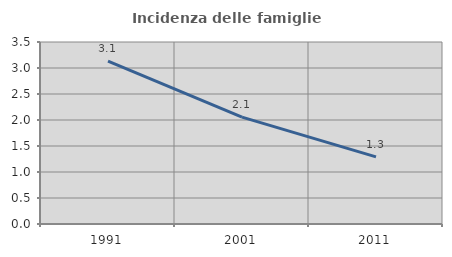
| Category | Incidenza delle famiglie numerose |
|---|---|
| 1991.0 | 3.133 |
| 2001.0 | 2.056 |
| 2011.0 | 1.29 |